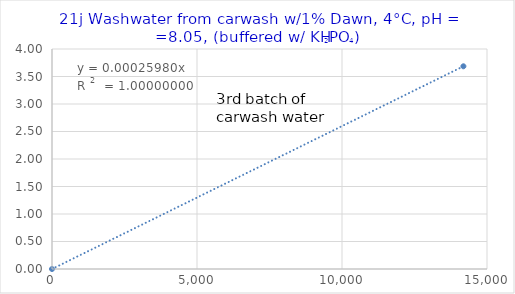
| Category | Series 0 |
|---|---|
| 0.0 | 0 |
| 14186.507936507936 | 3.686 |